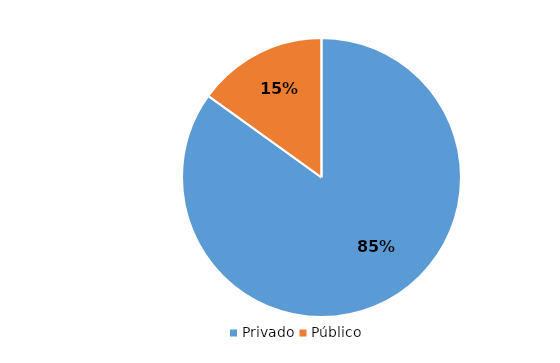
| Category | Permisos de Funcionamiento |
|---|---|
| Privado | 0.849 |
| Público | 0.151 |